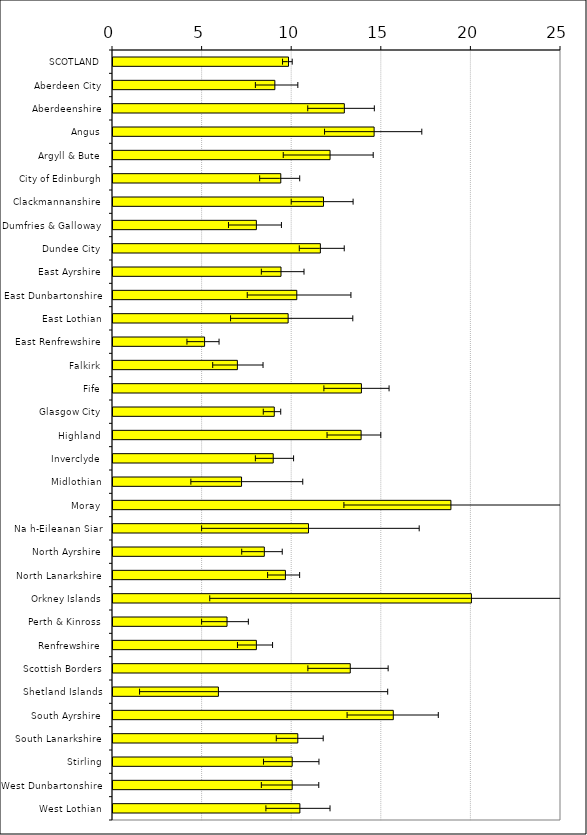
| Category | Estimate |
|---|---|
| SCOTLAND | 9.795 |
| Aberdeen City | 9.032 |
| Aberdeenshire | 12.909 |
| Angus | 14.571 |
| Argyll & Bute | 12.113 |
| City of Edinburgh | 9.364 |
| Clackmannanshire | 11.746 |
| Dumfries & Galloway | 8 |
| Dundee City | 11.571 |
| East Ayrshire | 9.375 |
| East Dunbartonshire | 10.256 |
| East Lothian | 9.773 |
| East Renfrewshire | 5.111 |
| Falkirk | 6.941 |
| Fife | 13.862 |
| Glasgow City | 9 |
| Highland | 13.846 |
| Inverclyde | 8.941 |
| Midlothian | 7.174 |
| Moray | 18.857 |
| Na h-Eileanan Siar | 10.909 |
| North Ayrshire | 8.444 |
| North Lanarkshire | 9.622 |
| Orkney Islands | 20 |
| Perth & Kinross | 6.364 |
| Renfrewshire | 8 |
| Scottish Borders | 13.239 |
| Shetland Islands | 5.882 |
| South Ayrshire | 15.641 |
| South Lanarkshire | 10.312 |
| Stirling | 10 |
| West Dunbartonshire | 10 |
| West Lothian | 10.429 |